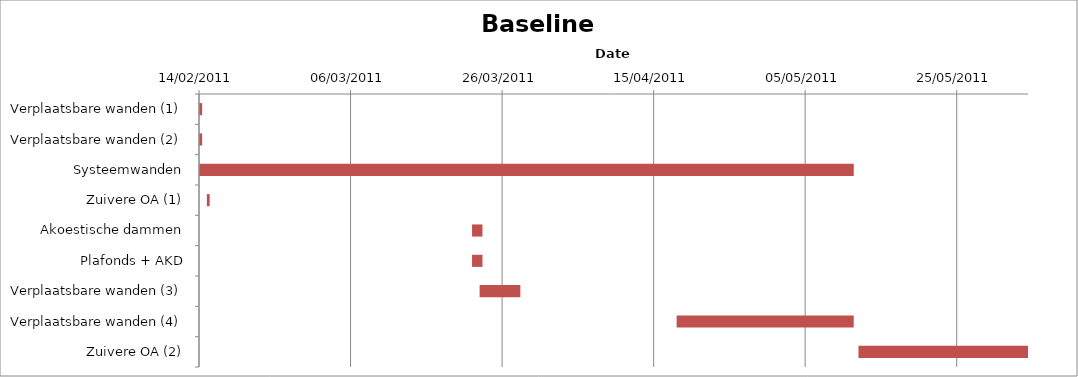
| Category | Baseline start | Actual duration |
|---|---|---|
| Verplaatsbare wanden (1) | 40588.333 | 0.375 |
| Verplaatsbare wanden (2) | 40588.333 | 0.375 |
| Systeemwanden | 40588.333 | 86.375 |
| Zuivere OA (1) | 40589.333 | 0.375 |
| Akoestische dammen | 40624.333 | 1.375 |
| Plafonds + AKD | 40624.333 | 1.375 |
| Verplaatsbare wanden (3) | 40625.333 | 5.375 |
| Verplaatsbare wanden (4) | 40651.333 | 23.375 |
| Zuivere OA (2) | 40675.333 | 22.375 |